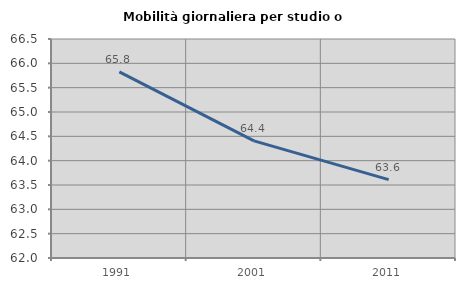
| Category | Mobilità giornaliera per studio o lavoro |
|---|---|
| 1991.0 | 65.826 |
| 2001.0 | 64.408 |
| 2011.0 | 63.609 |